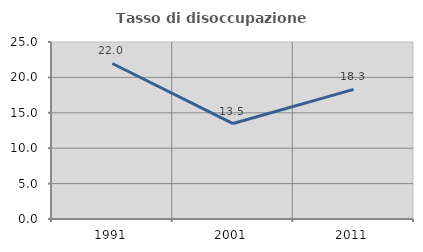
| Category | Tasso di disoccupazione giovanile  |
|---|---|
| 1991.0 | 21.965 |
| 2001.0 | 13.483 |
| 2011.0 | 18.31 |